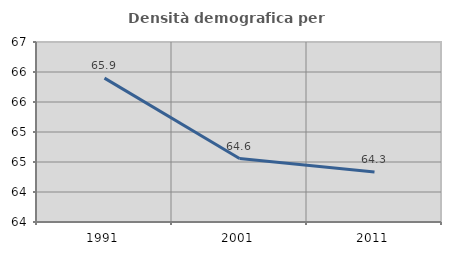
| Category | Densità demografica |
|---|---|
| 1991.0 | 65.898 |
| 2001.0 | 64.558 |
| 2011.0 | 64.335 |